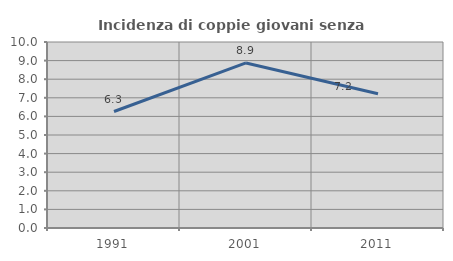
| Category | Incidenza di coppie giovani senza figli |
|---|---|
| 1991.0 | 6.263 |
| 2001.0 | 8.875 |
| 2011.0 | 7.219 |